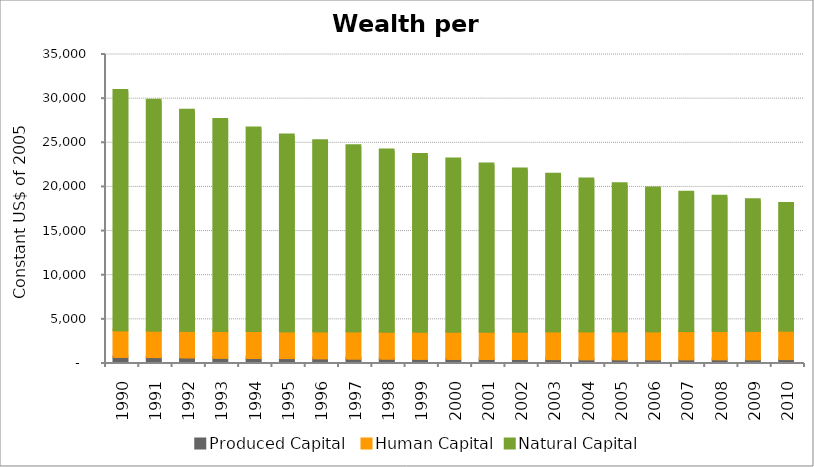
| Category | Produced Capital  | Human Capital | Natural Capital |
|---|---|---|---|
| 1990.0 | 581.22 | 3001.115 | 27171.158 |
| 1991.0 | 557.166 | 3006.712 | 26077.332 |
| 1992.0 | 526.958 | 3015.353 | 24976.929 |
| 1993.0 | 494.841 | 3026.398 | 23932.396 |
| 1994.0 | 466.459 | 3036.984 | 23005.3 |
| 1995.0 | 444.572 | 3050.321 | 22219.722 |
| 1996.0 | 423.962 | 3054.906 | 21572.951 |
| 1997.0 | 405.104 | 3064.79 | 21029.766 |
| 1998.0 | 387.967 | 3077.35 | 20541.644 |
| 1999.0 | 371.976 | 3091.801 | 20052.511 |
| 2000.0 | 355.472 | 3104.816 | 19528.739 |
| 2001.0 | 343.251 | 3115.881 | 18967.477 |
| 2002.0 | 336.48 | 3128.168 | 18386.825 |
| 2003.0 | 329.947 | 3141.323 | 17803.89 |
| 2004.0 | 322.438 | 3155.579 | 17239.255 |
| 2005.0 | 317.98 | 3170.97 | 16704.666 |
| 2006.0 | 317.904 | 3178.263 | 16199.562 |
| 2007.0 | 319.843 | 3190.937 | 15717.965 |
| 2008.0 | 322.6 | 3206.985 | 15257.821 |
| 2009.0 | 325.118 | 3223.78 | 14815.828 |
| 2010.0 | 328.584 | 3239.239 | 14390.069 |